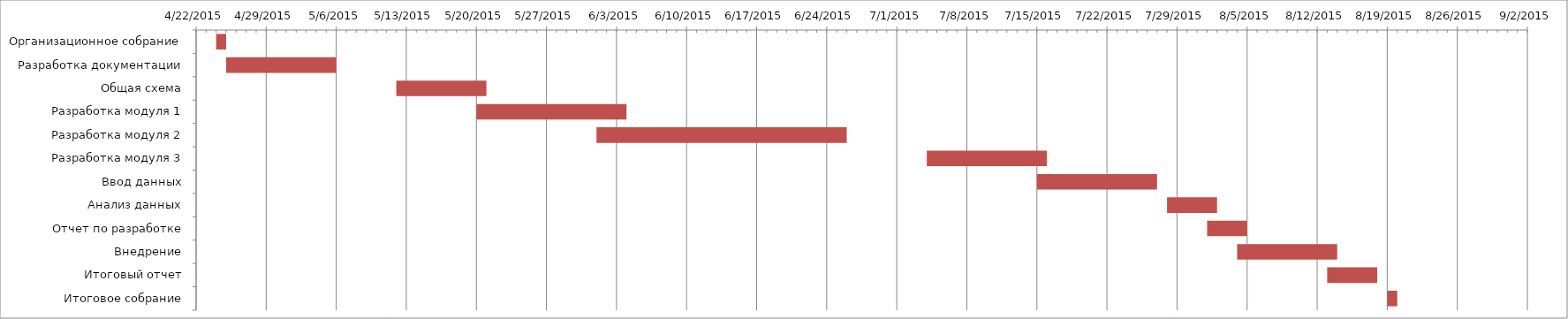
| Category | Дата начала | Длительность |
|---|---|---|
| Организационное собрание | 24/04/2015 | 1 |
| Разработка документации | 25/04/2015 | 11 |
| Общая схема | 12/05/2015 | 9 |
| Разработка модуля 1 | 20/05/2015 | 15 |
| Разработка модуля 2 | 01/06/2015 | 25 |
| Разработка модуля 3 | 04/07/2015 | 12 |
| Ввод данных | 15/07/2015 | 12 |
| Анализ данных | 28/07/2015 | 5 |
| Отчет по разработке | 01/08/2015 | 4 |
| Внедрение | 04/08/2015 | 10 |
| Итоговый отчет | 13/08/2015 | 5 |
| Итоговое собрание | 19/08/2015 | 1 |